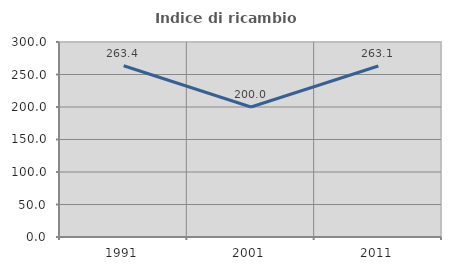
| Category | Indice di ricambio occupazionale  |
|---|---|
| 1991.0 | 263.415 |
| 2001.0 | 200 |
| 2011.0 | 263.095 |